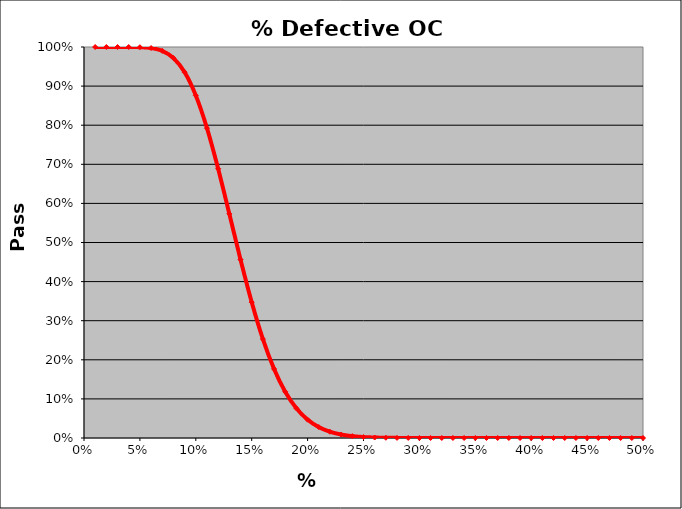
| Category | PASS RATE |
|---|---|
| 0.01 | 1 |
| 0.02 | 1 |
| 0.03 | 1 |
| 0.04 | 1 |
| 0.05 | 1 |
| 0.06 | 0.997 |
| 0.07 | 0.99 |
| 0.08 | 0.972 |
| 0.09 | 0.936 |
| 0.1 | 0.876 |
| 0.11 | 0.792 |
| 0.12 | 0.689 |
| 0.13 | 0.573 |
| 0.14 | 0.456 |
| 0.15 | 0.347 |
| 0.16 | 0.253 |
| 0.17 | 0.177 |
| 0.18 | 0.118 |
| 0.19 | 0.076 |
| 0.2 | 0.047 |
| 0.21 | 0.028 |
| 0.22 | 0.016 |
| 0.23 | 0.009 |
| 0.24 | 0.005 |
| 0.25 | 0.002 |
| 0.26 | 0.001 |
| 0.27 | 0.001 |
| 0.28 | 0 |
| 0.29 | 0 |
| 0.3 | 0 |
| 0.31 | 0 |
| 0.32 | 0 |
| 0.33 | 0 |
| 0.34 | 0 |
| 0.35 | 0 |
| 0.36 | 0 |
| 0.37 | 0 |
| 0.38 | 0 |
| 0.39 | 0 |
| 0.4 | 0 |
| 0.41 | 0 |
| 0.42 | 0 |
| 0.43 | 0 |
| 0.44 | 0 |
| 0.45 | 0 |
| 0.46 | 0 |
| 0.47 | 0 |
| 0.48 | 0 |
| 0.49 | 0 |
| 0.499999999999999 | 0 |